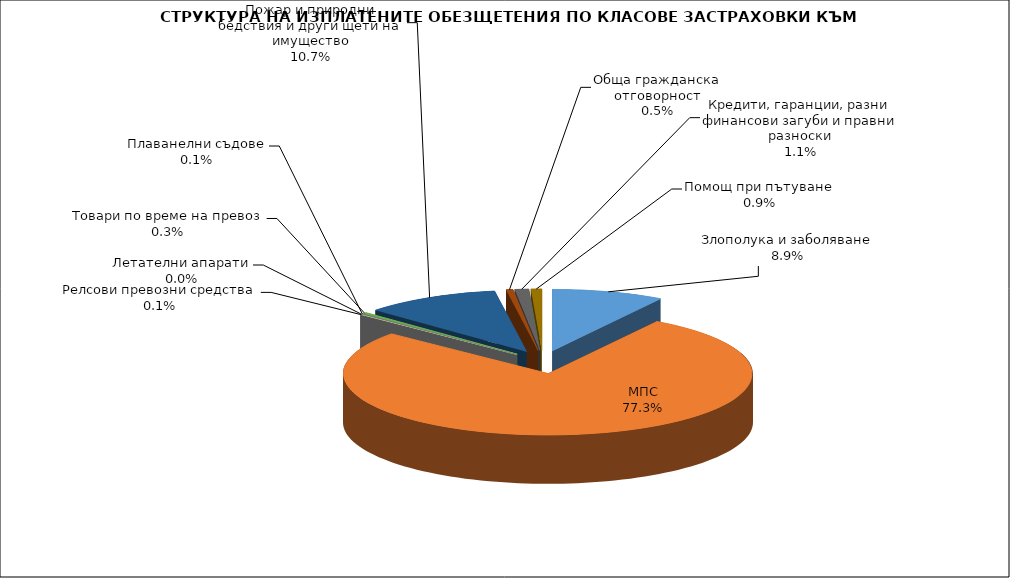
| Category | Злополука и заболяване |
|---|---|
| Злополука и заболяване | 0.089 |
| МПС | 0.773 |
| Релсови превозни средства | 0.001 |
| Летателни апарати | 0 |
| Плаванелни съдове | 0.001 |
| Товари по време на превоз | 0.003 |
| Пожар и природни бедствия и други щети на имущество | 0.107 |
| Обща гражданска отговорност | 0.005 |
| Кредити, гаранции, разни финансови загуби и правни разноски | 0.011 |
| Помощ при пътуване | 0.009 |